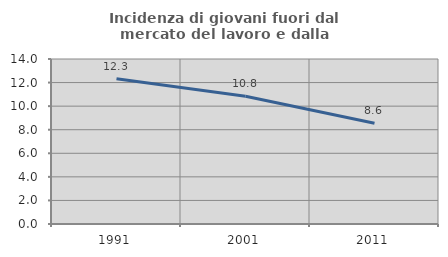
| Category | Incidenza di giovani fuori dal mercato del lavoro e dalla formazione  |
|---|---|
| 1991.0 | 12.331 |
| 2001.0 | 10.841 |
| 2011.0 | 8.554 |